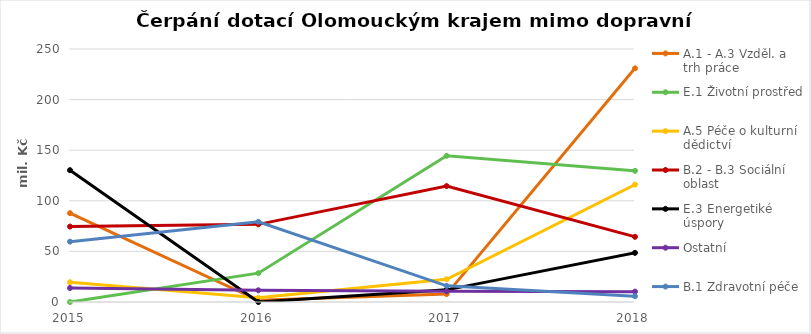
| Category | A.1 - A.3 Vzděl. a trh práce | E.1 Životní prostředí | A.5 Péče o kulturní dědictví | B.2 - B.3 Sociální oblast | E.3 Energetiké úspory | Ostatní | B.1 Zdravotní péče |
|---|---|---|---|---|---|---|---|
| 2015.0 | 87805 | 0 | 19556 | 74534 | 130243 | 13844 | 59623 |
| 2016.0 | 1682 | 28500 | 4098 | 76711 | 0 | 11586 | 79301 |
| 2017.0 | 7794 | 144492 | 22512 | 114555 | 12009 | 10579 | 15975 |
| 2018.0 | 230909 | 129606 | 116021 | 64403 | 48561 | 10249 | 5698 |